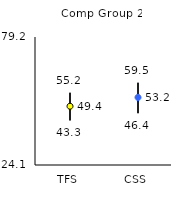
| Category | 25th | 75th | Mean |
|---|---|---|---|
| TFS | 43.3 | 55.2 | 49.4 |
| CSS | 46.4 | 59.5 | 53.21 |